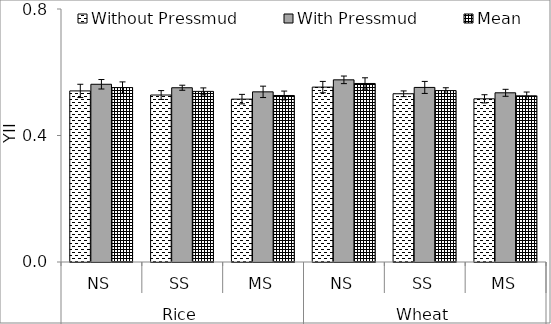
| Category | Without Pressmud | With Pressmud | Mean |
|---|---|---|---|
| 0 | 0.541 | 0.562 | 0.552 |
| 1 | 0.528 | 0.551 | 0.54 |
| 2 | 0.515 | 0.538 | 0.526 |
| 3 | 0.553 | 0.576 | 0.564 |
| 4 | 0.532 | 0.552 | 0.542 |
| 5 | 0.516 | 0.535 | 0.526 |